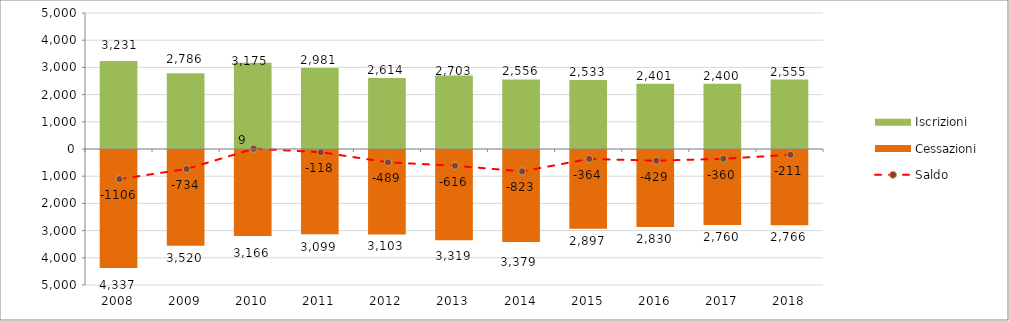
| Category | Iscrizioni | Cessazioni |
|---|---|---|
| 2008.0 | 3231 | -4337 |
| 2009.0 | 2786 | -3520 |
| 2010.0 | 3175 | -3166 |
| 2011.0 | 2981 | -3099 |
| 2012.0 | 2614 | -3103 |
| 2013.0 | 2703 | -3319 |
| 2014.0 | 2556 | -3379 |
| 2015.0 | 2533 | -2897 |
| 2016.0 | 2401 | -2830 |
| 2017.0 | 2400 | -2760 |
| 2018.0 | 2555 | -2766 |